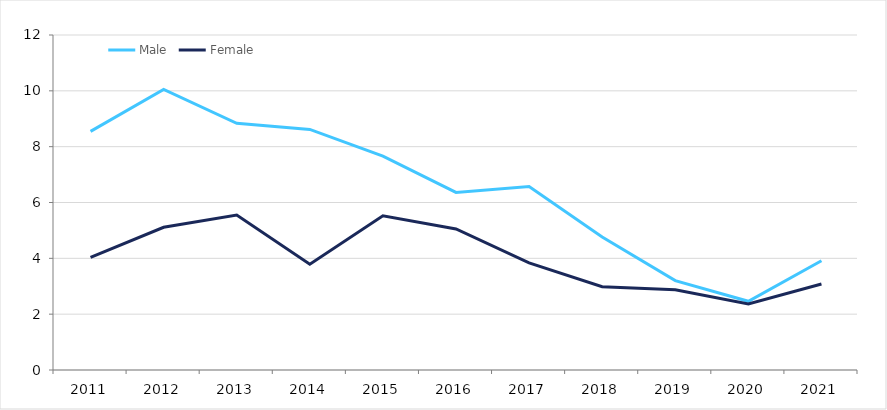
| Category | Male | Female |
|---|---|---|
| 2011.0 | 8.547 | 4.031 |
| 2012.0 | 10.052 | 5.112 |
| 2013.0 | 8.835 | 5.552 |
| 2014.0 | 8.619 | 3.792 |
| 2015.0 | 7.66 | 5.522 |
| 2016.0 | 6.362 | 5.05 |
| 2017.0 | 6.57 | 3.838 |
| 2018.0 | 4.763 | 2.982 |
| 2019.0 | 3.2 | 2.872 |
| 2020.0 | 2.462 | 2.363 |
| 2021.0 | 3.913 | 3.081 |